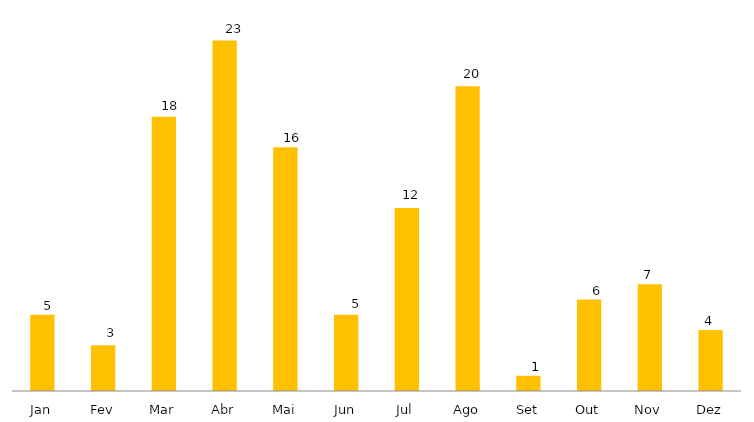
| Category | Projetos Iniciados em 2019 |
|---|---|
| Jan | 5 |
| Fev | 3 |
| Mar | 18 |
| Abr | 23 |
| Mai | 16 |
| Jun | 5 |
| Jul | 12 |
| Ago | 20 |
| Set | 1 |
| Out | 6 |
| Nov | 7 |
| Dez | 4 |